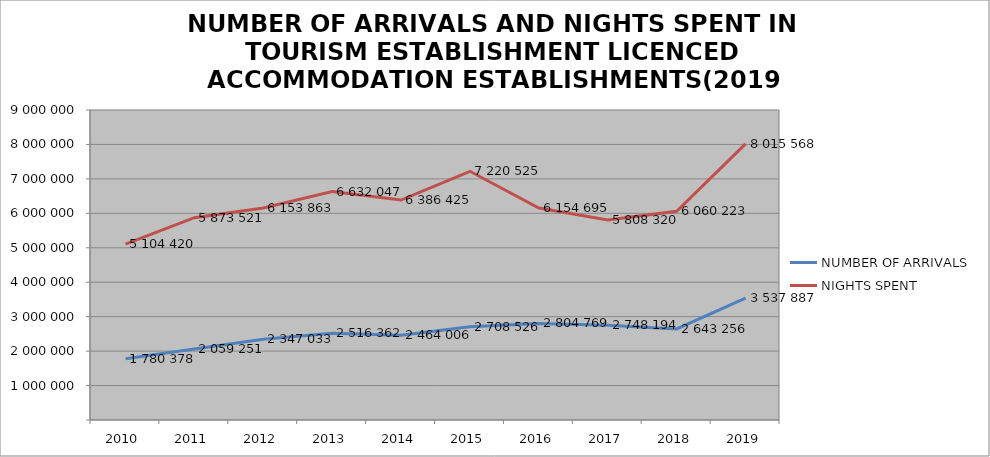
| Category | NUMBER OF ARRIVALS | NIGHTS SPENT |
|---|---|---|
| 2010 | 1780378 | 5104420 |
| 2011 | 2059251 | 5873521 |
| 2012 | 2347033 | 6153863 |
| 2013 | 2516362 | 6632047 |
| 2014 | 2464006 | 6386425 |
| 2015 | 2708526 | 7220525 |
| 2016 | 2804769 | 6154695 |
| 2017 | 2748194 | 5808320 |
| 2018 | 2643256 | 6060223 |
| 2019 | 3537887 | 8015568 |